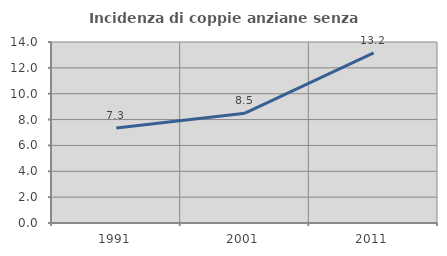
| Category | Incidenza di coppie anziane senza figli  |
|---|---|
| 1991.0 | 7.343 |
| 2001.0 | 8.497 |
| 2011.0 | 13.158 |